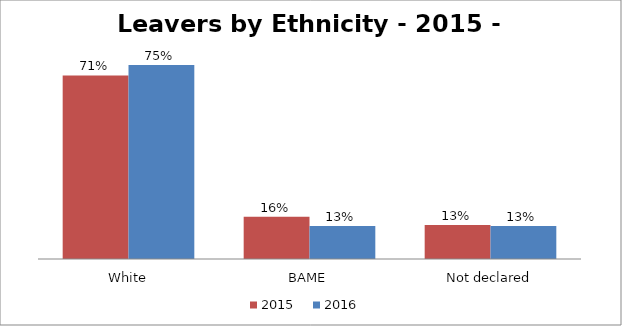
| Category | 2015
 | 2016
 |
|---|---|---|
| White | 0.706 | 0.746 |
| BAME | 0.163 | 0.127 |
| Not declared | 0.131 | 0.127 |